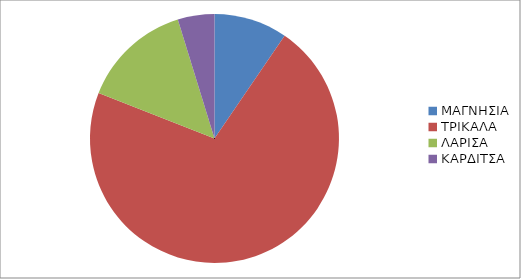
| Category | Series 0 |
|---|---|
| ΜΑΓΝΗΣΙΑ | 2 |
| ΤΡΙΚΑΛΑ | 15 |
| ΛΑΡΙΣΑ | 3 |
| ΚΑΡΔΙΤΣΑ | 1 |